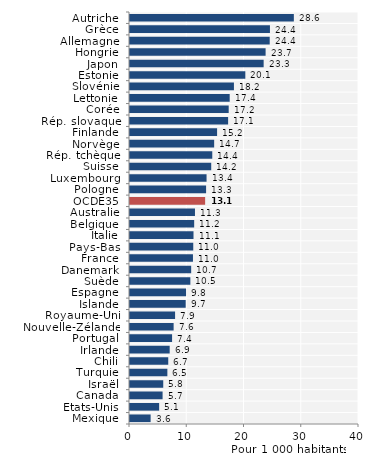
| Category | Series 0 |
|---|---|
| Autriche | 28.62 |
| Grèce | 24.444 |
| Allemagne | 24.404 |
| Hongrie | 23.687 |
| Japon | 23.345 |
| Estonie | 20.144 |
| Slovénie | 18.154 |
| Lettonie | 17.414 |
| Corée | 17.24 |
| Rép. slovaque | 17.139 |
| Finlande | 15.212 |
| Norvège | 14.701 |
| Rép. tchèque | 14.371 |
| Suisse | 14.186 |
| Luxembourg | 13.373 |
| Pologne | 13.291 |
| OCDE35 | 13.124 |
| Australie | 11.349 |
| Belgique | 11.21 |
| Italie | 11.092 |
| Pays-Bas | 11.049 |
| France | 10.997 |
| Danemark | 10.686 |
| Suède | 10.542 |
| Espagne | 9.792 |
| Islande | 9.728 |
| Royaume-Uni | 7.874 |
| Nouvelle-Zélande | 7.62 |
| Portugal | 7.35 |
| Irlande | 6.932 |
| Chili | 6.681 |
| Turquie | 6.527 |
| Israël | 5.806 |
| Canada | 5.693 |
| Etats-Unis | 5.091 |
| Mexique | 3.602 |